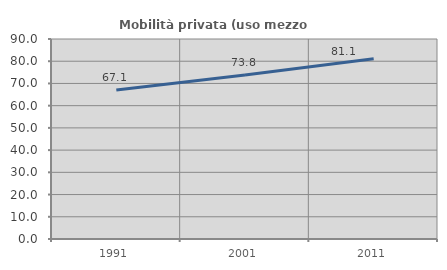
| Category | Mobilità privata (uso mezzo privato) |
|---|---|
| 1991.0 | 67.087 |
| 2001.0 | 73.777 |
| 2011.0 | 81.075 |